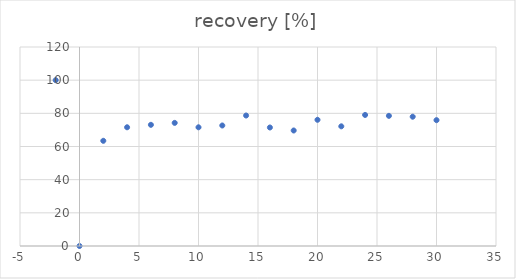
| Category | recovery [%] |
|---|---|
| -2.0 | 100 |
| 0.0 | 0 |
| 2.0 | 63.433 |
| 4.0 | 71.591 |
| 6.0 | 73.068 |
| 8.0 | 74.24 |
| 10.0 | 71.584 |
| 12.0 | 72.669 |
| 14.0 | 78.681 |
| 16.0 | 71.466 |
| 18.0 | 69.653 |
| 20.0 | 76.105 |
| 22.0 | 72.168 |
| 24.0 | 79.027 |
| 26.0 | 78.485 |
| 28.0 | 77.962 |
| 30.0 | 75.878 |